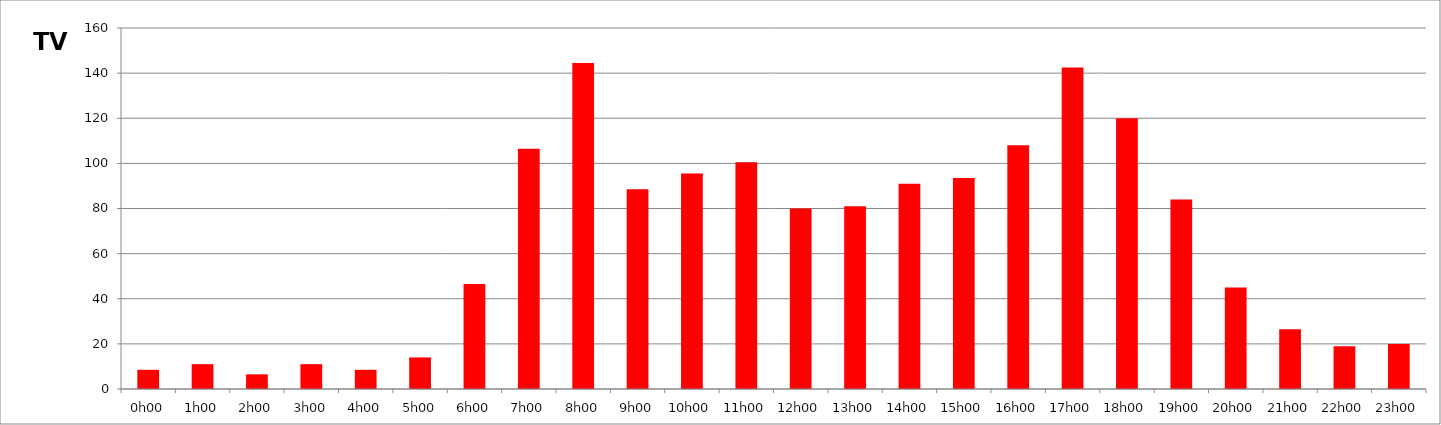
| Category | TV |
|---|---|
| 0.0 | 8.5 |
| 0.041666666666666664 | 11 |
| 0.08333333333333333 | 6.5 |
| 0.125 | 11 |
| 0.16666666666666666 | 8.5 |
| 0.20833333333333334 | 14 |
| 0.25 | 46.5 |
| 0.2916666666666667 | 106.5 |
| 0.3333333333333333 | 144.5 |
| 0.375 | 88.5 |
| 0.4166666666666667 | 95.5 |
| 0.4583333333333333 | 100.5 |
| 0.5 | 80 |
| 0.5416666666666666 | 81 |
| 0.5833333333333334 | 91 |
| 0.625 | 93.5 |
| 0.6666666666666666 | 108 |
| 0.7083333333333334 | 142.5 |
| 0.75 | 120 |
| 0.7916666666666666 | 84 |
| 0.8333333333333334 | 45 |
| 0.875 | 26.5 |
| 0.9166666666666666 | 19 |
| 0.9583333333333334 | 20 |